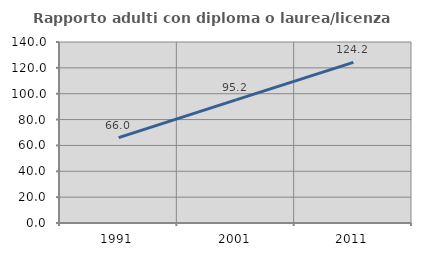
| Category | Rapporto adulti con diploma o laurea/licenza media  |
|---|---|
| 1991.0 | 66.01 |
| 2001.0 | 95.238 |
| 2011.0 | 124.221 |